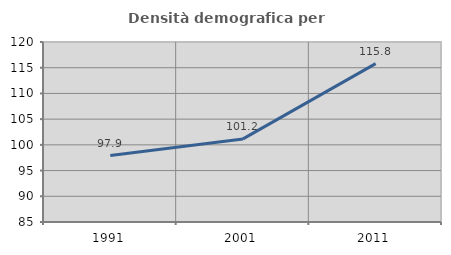
| Category | Densità demografica |
|---|---|
| 1991.0 | 97.919 |
| 2001.0 | 101.157 |
| 2011.0 | 115.802 |